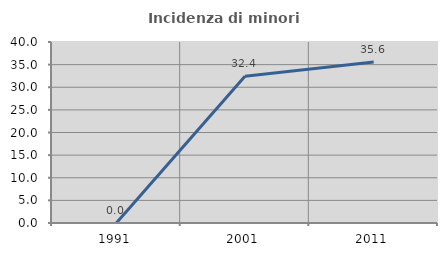
| Category | Incidenza di minori stranieri |
|---|---|
| 1991.0 | 0 |
| 2001.0 | 32.432 |
| 2011.0 | 35.556 |